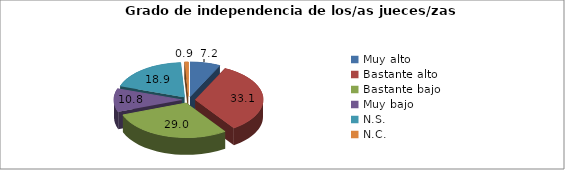
| Category | % |
|---|---|
| Muy alto | 7.2 |
| Bastante alto | 33.1 |
| Bastante bajo | 29 |
| Muy bajo  | 10.8 |
| N.S.  | 18.9 |
| N.C.  | 0.9 |